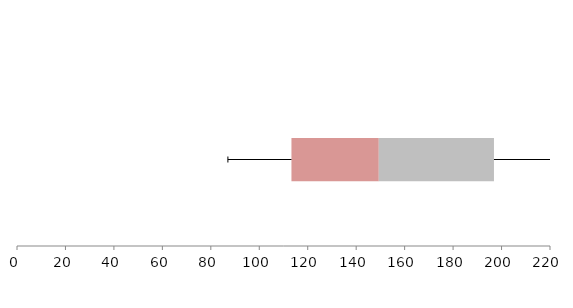
| Category | Series 1 | Series 2 | Series 3 |
|---|---|---|---|
| 0 | 113.286 | 36.048 | 47.538 |